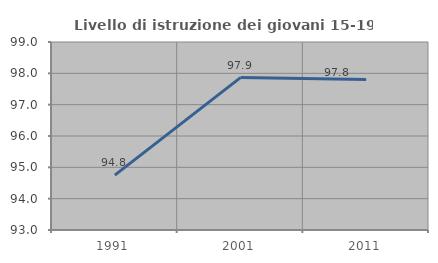
| Category | Livello di istruzione dei giovani 15-19 anni |
|---|---|
| 1991.0 | 94.751 |
| 2001.0 | 97.863 |
| 2011.0 | 97.802 |